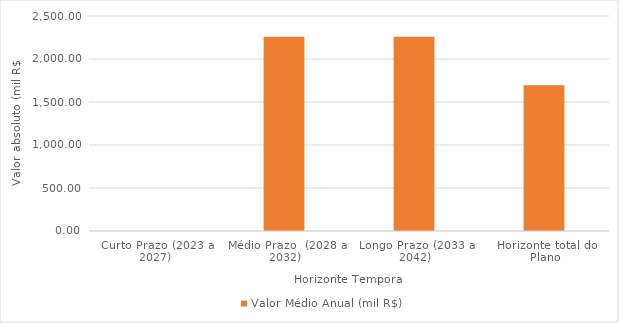
| Category | Valor Médio Anual (mil R$) |
|---|---|
| Curto Prazo (2023 a 2027) | 0 |
| Médio Prazo  (2028 a 2032) | 2260 |
| Longo Prazo (2033 a 2042) | 2260 |
| Horizonte total do Plano | 1695 |